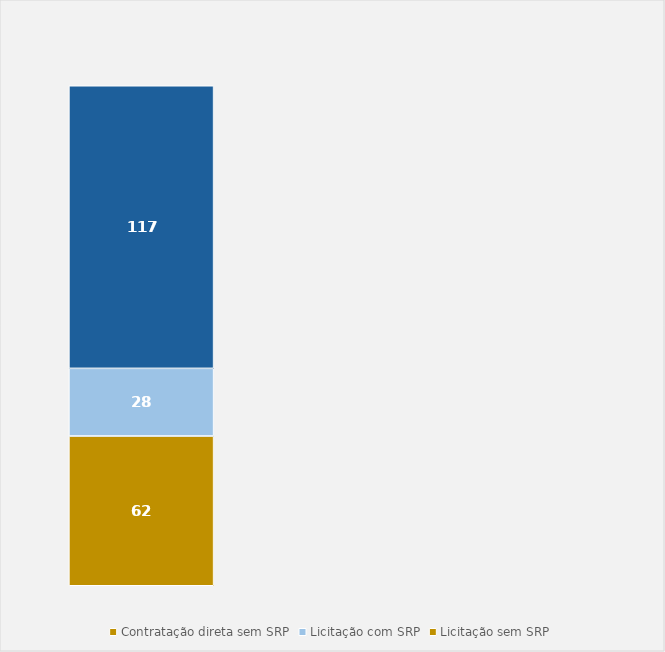
| Category | Contratação direta sem SRP | Licitação com SRP | Licitação sem SRP |
|---|---|---|---|
| Total | 62 | 28 | 117 |